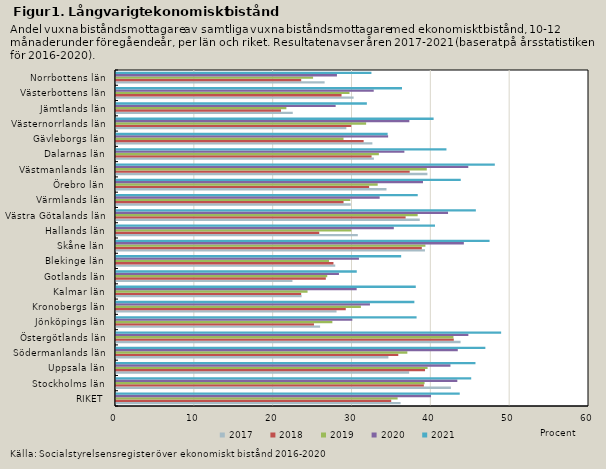
| Category | 2017 | 2018 | 2019 | 2020 | 2021 |
|---|---|---|---|---|---|
| RIKET | 36.1 | 34.91 | 35.722 | 39.96 | 43.603 |
| Stockholms län | 42.483 | 39.051 | 39.142 | 43.296 | 45.058 |
| Uppsala län | 37.188 | 39.2 | 39.523 | 42.424 | 45.598 |
| Södermanlands län | 34.555 | 35.807 | 36.957 | 43.355 | 46.852 |
| Östergötlands län | 43.707 | 42.848 | 42.804 | 44.697 | 48.855 |
| Jönköpings län | 25.888 | 25.111 | 27.445 | 29.977 | 38.129 |
| Kronobergs län | 27.976 | 29.145 | 31.065 | 32.215 | 37.847 |
| Kalmar län | 23.543 | 23.489 | 24.299 | 30.53 | 38.027 |
| Gotlands län | 22.382 | 26.616 | 26.797 | 28.279 | 30.542 |
| Blekinge län | 27.811 | 27.583 | 27.027 | 30.82 | 36.173 |
| Skåne län | 39.193 | 38.792 | 39.249 | 44.124 | 47.388 |
| Hallands län | 30.674 | 25.781 | 29.855 | 35.24 | 40.464 |
| Västra Götalands län | 38.533 | 36.738 | 38.266 | 42.12 | 45.647 |
| Värmlands län | 29.778 | 28.864 | 29.718 | 33.446 | 38.275 |
| Örebro län | 34.313 | 32.109 | 33.194 | 38.94 | 43.732 |
| Västmanlands län | 39.504 | 37.257 | 39.423 | 44.687 | 48.053 |
| Dalarnas län | 32.715 | 32.418 | 33.344 | 36.58 | 41.917 |
| Gävleborgs län | 32.522 | 31.413 | 28.861 | 34.518 | 34.456 |
| Västernorrlands län | 29.22 | 29.837 | 31.729 | 37.211 | 40.289 |
| Jämtlands län | 22.423 | 20.927 | 21.615 | 27.863 | 31.821 |
| Västerbottens län | 30.142 | 28.609 | 29.622 | 32.694 | 36.279 |
| Norrbottens län | 26.464 | 23.493 | 25 | 28.027 | 32.401 |